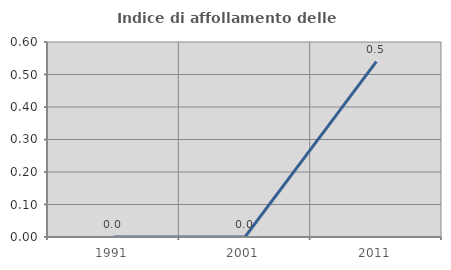
| Category | Indice di affollamento delle abitazioni  |
|---|---|
| 1991.0 | 0 |
| 2001.0 | 0 |
| 2011.0 | 0.54 |